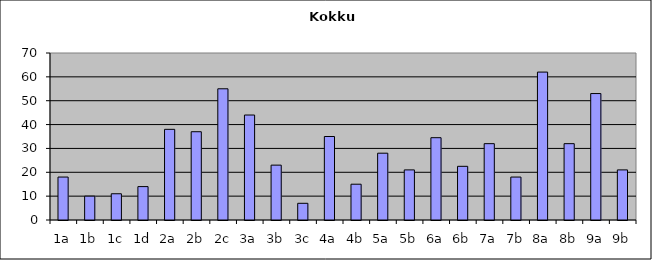
| Category | Kokku |
|---|---|
| 1a | 18 |
| 1b | 10 |
| 1c | 11 |
| 1d | 14 |
| 2a | 38 |
| 2b | 37 |
| 2c | 55 |
| 3a | 44 |
| 3b | 23 |
| 3c | 7 |
| 4a | 35 |
| 4b | 15 |
| 5a | 28 |
| 5b | 21 |
| 6a | 34.5 |
| 6b | 22.5 |
| 7a | 32 |
| 7b | 18 |
| 8a | 62 |
| 8b | 32 |
| 9a | 53 |
| 9b | 21 |